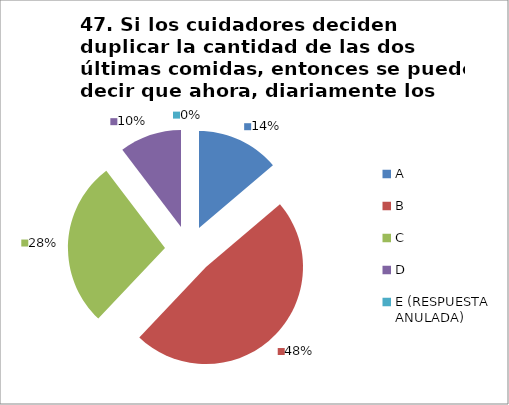
| Category | CANTIDAD DE RESPUESTAS PREGUNTA (47) | PORCENTAJE |
|---|---|---|
| A | 4 | 0.138 |
| B | 14 | 0.483 |
| C | 8 | 0.276 |
| D | 3 | 0.103 |
| E (RESPUESTA ANULADA) | 0 | 0 |